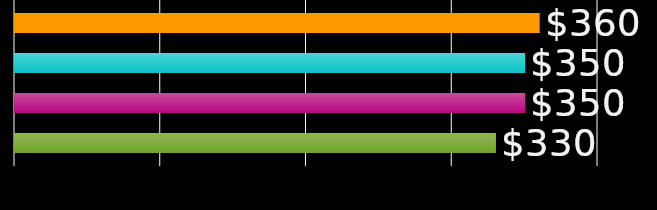
| Category | roommate 1 | roommate 2 | roommate 3 | roommate 4 |
|---|---|---|---|---|
| 0 | 360 | 350 | 350 | 330 |